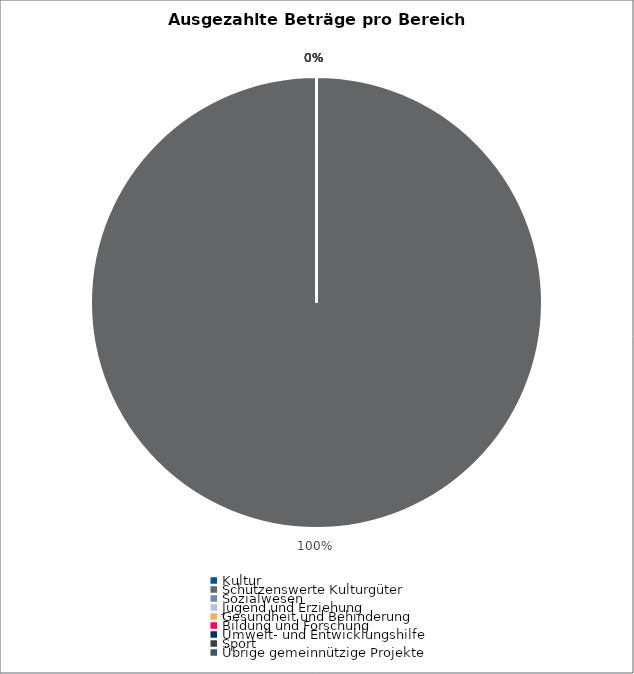
| Category | Series 0 |
|---|---|
| Kultur | 0 |
| Schützenswerte Kulturgüter | 7667000 |
| Sozialwesen | 0 |
| Jugend und Erziehung | 0 |
| Gesundheit und Behinderung | 0 |
| Bildung und Forschung | 0 |
| Umwelt- und Entwicklungshilfe | 0 |
| Sport | 0 |
| Übrige gemeinnützige Projekte | 0 |